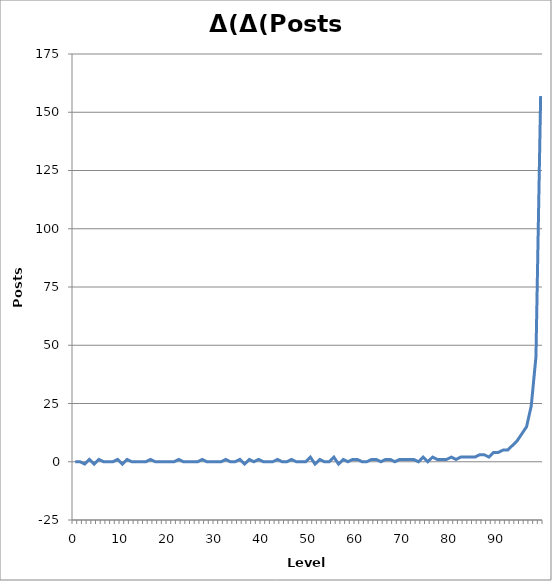
| Category | Δ(Δ(Posts Required)) |
|---|---|
| 0.0 | 0 |
| 1.0 | 0 |
| 2.0 | -1 |
| 3.0 | 1 |
| 4.0 | -1 |
| 5.0 | 1 |
| 6.0 | 0 |
| 7.0 | 0 |
| 8.0 | 0 |
| 9.0 | 1 |
| 10.0 | -1 |
| 11.0 | 1 |
| 12.0 | 0 |
| 13.0 | 0 |
| 14.0 | 0 |
| 15.0 | 0 |
| 16.0 | 1 |
| 17.0 | 0 |
| 18.0 | 0 |
| 19.0 | 0 |
| 20.0 | 0 |
| 21.0 | 0 |
| 22.0 | 1 |
| 23.0 | 0 |
| 24.0 | 0 |
| 25.0 | 0 |
| 26.0 | 0 |
| 27.0 | 1 |
| 28.0 | 0 |
| 29.0 | 0 |
| 30.0 | 0 |
| 31.0 | 0 |
| 32.0 | 1 |
| 33.0 | 0 |
| 34.0 | 0 |
| 35.0 | 1 |
| 36.0 | -1 |
| 37.0 | 1 |
| 38.0 | 0 |
| 39.0 | 1 |
| 40.0 | 0 |
| 41.0 | 0 |
| 42.0 | 0 |
| 43.0 | 1 |
| 44.0 | 0 |
| 45.0 | 0 |
| 46.0 | 1 |
| 47.0 | 0 |
| 48.0 | 0 |
| 49.0 | 0 |
| 50.0 | 2 |
| 51.0 | -1 |
| 52.0 | 1 |
| 53.0 | 0 |
| 54.0 | 0 |
| 55.0 | 2 |
| 56.0 | -1 |
| 57.0 | 1 |
| 58.0 | 0 |
| 59.0 | 1 |
| 60.0 | 1 |
| 61.0 | 0 |
| 62.0 | 0 |
| 63.0 | 1 |
| 64.0 | 1 |
| 65.0 | 0 |
| 66.0 | 1 |
| 67.0 | 1 |
| 68.0 | 0 |
| 69.0 | 1 |
| 70.0 | 1 |
| 71.0 | 1 |
| 72.0 | 1 |
| 73.0 | 0 |
| 74.0 | 2 |
| 75.0 | 0 |
| 76.0 | 2 |
| 77.0 | 1 |
| 78.0 | 1 |
| 79.0 | 1 |
| 80.0 | 2 |
| 81.0 | 1 |
| 82.0 | 2 |
| 83.0 | 2 |
| 84.0 | 2 |
| 85.0 | 2 |
| 86.0 | 3 |
| 87.0 | 3 |
| 88.0 | 2 |
| 89.0 | 4 |
| 90.0 | 4 |
| 91.0 | 5 |
| 92.0 | 5 |
| 93.0 | 7 |
| 94.0 | 9 |
| 95.0 | 12 |
| 96.0 | 15 |
| 97.0 | 24 |
| 98.0 | 45 |
| 99.0 | 157 |